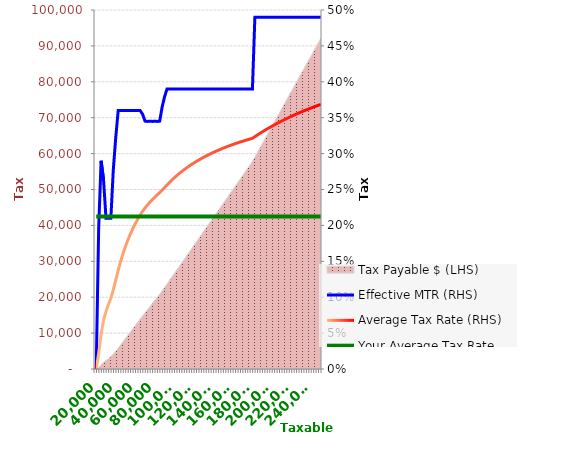
| Category | Effective MTR (RHS) | Average Tax Rate (RHS) | Your Average Tax Rate (RHS) |
|---|---|---|---|
| 20000.0 | 0 | 0 | 0.212 |
| 22500.0 | 0.195 | 0.022 | 0.212 |
| 25000.0 | 0.29 | 0.049 | 0.212 |
| 27500.0 | 0.264 | 0.068 | 0.212 |
| 30000.0 | 0.21 | 0.08 | 0.212 |
| 32500.0 | 0.21 | 0.09 | 0.212 |
| 35000.0 | 0.21 | 0.098 | 0.212 |
| 37500.0 | 0.278 | 0.11 | 0.212 |
| 40000.0 | 0.322 | 0.124 | 0.212 |
| 42500.0 | 0.36 | 0.138 | 0.212 |
| 45000.0 | 0.36 | 0.15 | 0.212 |
| 47500.0 | 0.36 | 0.161 | 0.212 |
| 50000.0 | 0.36 | 0.171 | 0.212 |
| 52500.0 | 0.36 | 0.18 | 0.212 |
| 55000.0 | 0.36 | 0.188 | 0.212 |
| 57500.0 | 0.36 | 0.196 | 0.212 |
| 60000.0 | 0.36 | 0.202 | 0.212 |
| 62500.0 | 0.36 | 0.209 | 0.212 |
| 65000.0 | 0.36 | 0.215 | 0.212 |
| 67500.0 | 0.355 | 0.22 | 0.212 |
| 70000.0 | 0.345 | 0.224 | 0.212 |
| 72500.0 | 0.345 | 0.228 | 0.212 |
| 75000.0 | 0.345 | 0.232 | 0.212 |
| 77500.0 | 0.345 | 0.236 | 0.212 |
| 80000.0 | 0.345 | 0.239 | 0.212 |
| 82500.0 | 0.345 | 0.243 | 0.212 |
| 85000.0 | 0.345 | 0.246 | 0.212 |
| 87500.0 | 0.365 | 0.249 | 0.212 |
| 90000.0 | 0.379 | 0.253 | 0.212 |
| 92500.0 | 0.39 | 0.256 | 0.212 |
| 95000.0 | 0.39 | 0.26 | 0.212 |
| 97500.0 | 0.39 | 0.263 | 0.212 |
| 100000.0 | 0.39 | 0.266 | 0.212 |
| 102500.0 | 0.39 | 0.269 | 0.212 |
| 105000.0 | 0.39 | 0.272 | 0.212 |
| 107500.0 | 0.39 | 0.275 | 0.212 |
| 110000.0 | 0.39 | 0.278 | 0.212 |
| 112500.0 | 0.39 | 0.28 | 0.212 |
| 115000.0 | 0.39 | 0.282 | 0.212 |
| 117500.0 | 0.39 | 0.285 | 0.212 |
| 120000.0 | 0.39 | 0.287 | 0.212 |
| 122500.0 | 0.39 | 0.289 | 0.212 |
| 125000.0 | 0.39 | 0.291 | 0.212 |
| 127500.0 | 0.39 | 0.293 | 0.212 |
| 130000.0 | 0.39 | 0.295 | 0.212 |
| 132500.0 | 0.39 | 0.297 | 0.212 |
| 135000.0 | 0.39 | 0.298 | 0.212 |
| 137500.0 | 0.39 | 0.3 | 0.212 |
| 140000.0 | 0.39 | 0.302 | 0.212 |
| 142500.0 | 0.39 | 0.303 | 0.212 |
| 145000.0 | 0.39 | 0.305 | 0.212 |
| 147500.0 | 0.39 | 0.306 | 0.212 |
| 150000.0 | 0.39 | 0.308 | 0.212 |
| 152500.0 | 0.39 | 0.309 | 0.212 |
| 155000.0 | 0.39 | 0.31 | 0.212 |
| 157500.0 | 0.39 | 0.311 | 0.212 |
| 160000.0 | 0.39 | 0.313 | 0.212 |
| 162500.0 | 0.39 | 0.314 | 0.212 |
| 165000.0 | 0.39 | 0.315 | 0.212 |
| 167500.0 | 0.39 | 0.316 | 0.212 |
| 170000.0 | 0.39 | 0.317 | 0.212 |
| 172500.0 | 0.39 | 0.318 | 0.212 |
| 175000.0 | 0.39 | 0.319 | 0.212 |
| 177500.0 | 0.39 | 0.32 | 0.212 |
| 180000.0 | 0.39 | 0.321 | 0.212 |
| 182500.0 | 0.49 | 0.324 | 0.212 |
| 185000.0 | 0.49 | 0.326 | 0.212 |
| 187500.0 | 0.49 | 0.328 | 0.212 |
| 190000.0 | 0.49 | 0.33 | 0.212 |
| 192500.0 | 0.49 | 0.332 | 0.212 |
| 195000.0 | 0.49 | 0.334 | 0.212 |
| 197500.0 | 0.49 | 0.336 | 0.212 |
| 200000.0 | 0.49 | 0.338 | 0.212 |
| 202500.0 | 0.49 | 0.34 | 0.212 |
| 205000.0 | 0.49 | 0.342 | 0.212 |
| 207500.0 | 0.49 | 0.344 | 0.212 |
| 210000.0 | 0.49 | 0.345 | 0.212 |
| 212500.0 | 0.49 | 0.347 | 0.212 |
| 215000.0 | 0.49 | 0.349 | 0.212 |
| 217500.0 | 0.49 | 0.35 | 0.212 |
| 220000.0 | 0.49 | 0.352 | 0.212 |
| 222500.0 | 0.49 | 0.354 | 0.212 |
| 225000.0 | 0.49 | 0.355 | 0.212 |
| 227500.0 | 0.49 | 0.357 | 0.212 |
| 230000.0 | 0.49 | 0.358 | 0.212 |
| 232500.0 | 0.49 | 0.359 | 0.212 |
| 235000.0 | 0.49 | 0.361 | 0.212 |
| 237500.0 | 0.49 | 0.362 | 0.212 |
| 240000.0 | 0.49 | 0.363 | 0.212 |
| 242500.0 | 0.49 | 0.365 | 0.212 |
| 245000.0 | 0.49 | 0.366 | 0.212 |
| 247500.0 | 0.49 | 0.367 | 0.212 |
| 250000.0 | 0.49 | 0.369 | 0.212 |